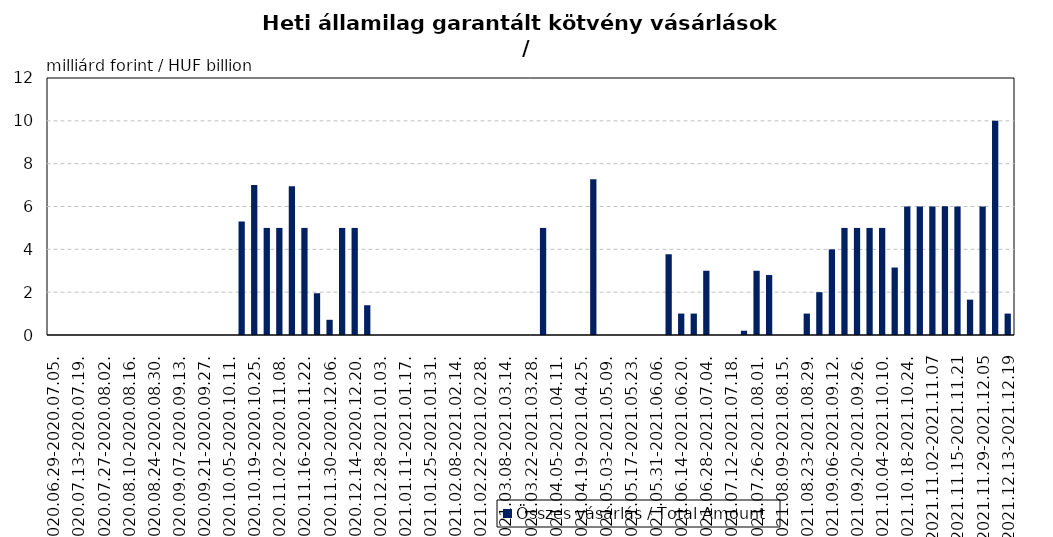
| Category | Összes vásárlás / Total Amount |
|---|---|
| 2020.06.29-2020.07.05. | 0 |
| 2020.07.06-2020.07.12. | 0 |
| 2020.07.13-2020.07.19. | 0 |
| 2020.07.20-2020.07.26. | 0 |
| 2020.07.27-2020.08.02. | 0 |
| 2020.08.03-2020.08.09. | 0 |
| 2020.08.10-2020.08.16. | 0 |
| 2020.08.17-2020.08.23. | 0 |
| 2020.08.24-2020.08.30. | 0 |
| 2020.08.31-2020.09.06. | 0 |
| 2020.09.07-2020.09.13. | 0 |
| 2020.09.14-2020.09.20. | 0 |
| 2020.09.21-2020.09.27. | 0 |
| 2020.09.28-2020.10.04. | 0 |
| 2020.10.05-2020.10.11. | 0 |
| 2020.10.12-2020.10.18. | 5.3 |
| 2020.10.19-2020.10.25. | 7 |
| 2020.10.26-2020.11.01. | 5 |
| 2020.11.02-2020.11.08. | 5 |
| 2020.11.09-2020.11.15. | 6.95 |
| 2020.11.16-2020.11.22. | 5 |
| 2020.11.23-2020.11.29. | 1.95 |
| 2020.11.30-2020.12.06. | 0.71 |
| 2020.12.07-2020.12.13. | 5 |
| 2020.12.14-2020.12.20. | 5 |
| 2020.12.21-2020.12.27. | 1.39 |
| 2020.12.28-2021.01.03. | 0 |
| 2021.01.04-2021.01.10. | 0 |
| 2021.01.11-2021.01.17. | 0 |
| 2021.01.18-2021.01.24. | 0 |
| 2021.01.25-2021.01.31. | 0 |
| 2021.02.01-2021.02.07. | 0 |
| 2021.02.08-2021.02.14. | 0 |
| 2021.02.15-2021.02.21. | 0 |
| 2021.02.22-2021.02.28. | 0 |
| 2021.03.01-2021.03.07. | 0 |
| 2021.03.08-2021.03.14. | 0 |
| 2021.03.15-2021.03.21. | 0 |
| 2021.03.22-2021.03.28. | 0 |
| 2021.03.29-2021.04.04. | 5 |
| 2021.04.05-2021.04.11. | 0 |
| 2021.04.12-2021.04.18. | 0 |
| 2021.04.19-2021.04.25. | 0 |
| 2021.04.26-2021.05.02. | 7.27 |
| 2021.05.03-2021.05.09. | 0 |
| 2021.05.10-2021.05.16. | 0 |
| 2021.05.17-2021.05.23. | 0 |
| 2021.05.24-2021.05.30. | 0 |
| 2021.05.31-2021.06.06. | 0 |
| 2021.06.07-2021.06.13. | 3.77 |
| 2021.06.14-2021.06.20. | 1 |
| 2021.06.21-2021.06.27. | 1 |
| 2021.06.28-2021.07.04. | 3 |
| 2021.07.05-2021.07.11. | 0 |
| 2021.07.12-2021.07.18. | 0 |
| 2021.07.19-2021.07.25. | 0.2 |
| 2021.07.26-2021.08.01. | 3 |
| 2021.08.02-2021.08.08. | 2.8 |
| 2021.08.09-2021.08.15. | 0 |
| 2021.08.16-2021.08.22. | 0 |
| 2021.08.23-2021.08.29. | 1 |
| 2021.08.30-2021.09.05. | 2 |
| 2021.09.06-2021.09.12. | 4 |
| 2021.09.13-2021.09.19. | 5 |
| 2021.09.20-2021.09.26. | 5 |
| 2021.09.27-2021.10.03. | 5 |
| 2021.10.04-2021.10.10. | 5 |
| 2021.10.11-2021.10.17. | 3.15 |
| 2021.10.18-2021.10.24. | 6 |
| 2021.10.25-2021.10.31. | 6 |
| 2021.11.02-2021.11.07 | 6 |
| 2021.11.08-2021.11.14 | 6.016 |
| 2021.11.15-2021.11.21 | 6 |
| 2021.11.22-2021.11.28 | 1.65 |
| 2021.11.29-2021.12.05 | 6 |
| 2021.12.06-2021.12.12 | 10 |
| 2021.12.13-2021.12.19 | 1 |